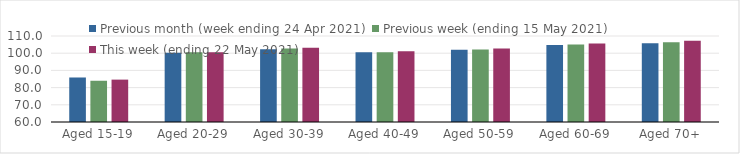
| Category | Previous month (week ending 24 Apr 2021) | Previous week (ending 15 May 2021) | This week (ending 22 May 2021) |
|---|---|---|---|
| Aged 15-19 | 85.88 | 83.98 | 84.64 |
| Aged 20-29 | 100.19 | 100.58 | 100.48 |
| Aged 30-39 | 102.33 | 102.75 | 103.13 |
| Aged 40-49 | 100.52 | 100.49 | 101.12 |
| Aged 50-59 | 102.05 | 102.15 | 102.75 |
| Aged 60-69 | 104.71 | 105.03 | 105.58 |
| Aged 70+ | 105.72 | 106.36 | 107.29 |